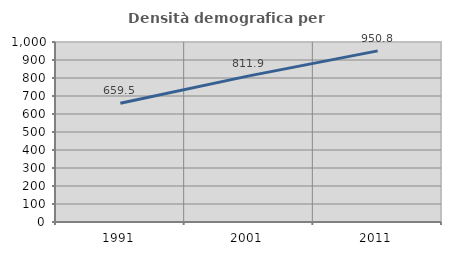
| Category | Densità demografica |
|---|---|
| 1991.0 | 659.488 |
| 2001.0 | 811.856 |
| 2011.0 | 950.793 |